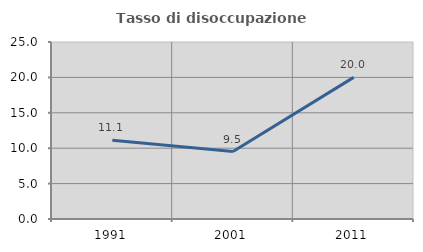
| Category | Tasso di disoccupazione giovanile  |
|---|---|
| 1991.0 | 11.111 |
| 2001.0 | 9.524 |
| 2011.0 | 20 |